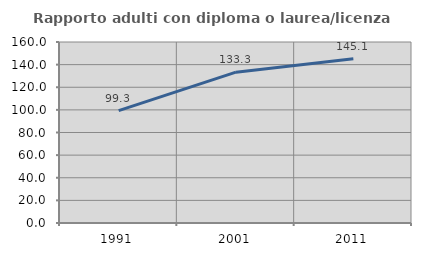
| Category | Rapporto adulti con diploma o laurea/licenza media  |
|---|---|
| 1991.0 | 99.329 |
| 2001.0 | 133.333 |
| 2011.0 | 145.143 |